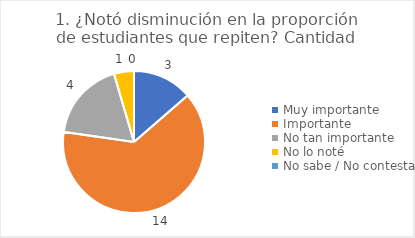
| Category | 1. ¿Notó disminución en la proporción de estudiantes que repiten? |
|---|---|
| Muy importante  | 0.136 |
| Importante  | 0.636 |
| No tan importante  | 0.182 |
| No lo noté  | 0.045 |
| No sabe / No contesta | 0 |